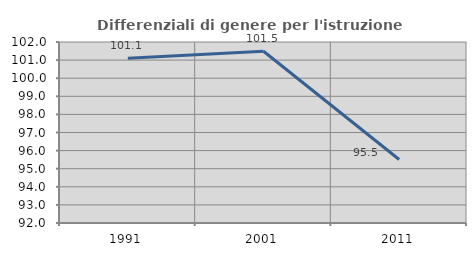
| Category | Differenziali di genere per l'istruzione superiore |
|---|---|
| 1991.0 | 101.109 |
| 2001.0 | 101.487 |
| 2011.0 | 95.507 |